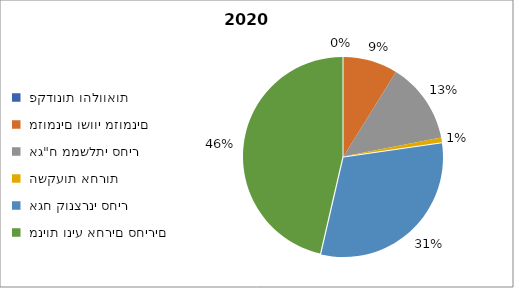
| Category | מנורה מבטחים השתלמות מסלול לטווח ארוך [1861] - פברואר 2020 |
|---|---|
|  פקדונות והלוואות  | 0 |
|  מזומנים ושווי מזומנים   | 528 |
|  אג"ח ממשלתי סחיר  | 784 |
|  השקעות אחרות  | 46 |
|  אגח קונצרני סחיר  | 1845 |
|  מניות וניע אחרים סחירים   | 2771 |